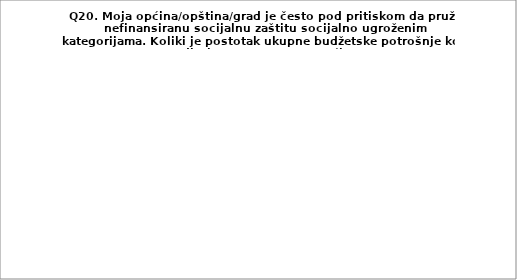
| Category | Series 0 |
|---|---|
| 2% | 46.552 |
| 3% | 18.966 |
| 5% | 13.793 |
| 7% i više | 13.793 |
| Moja opština/općina/grad nema takva izdvajanja | 6.897 |